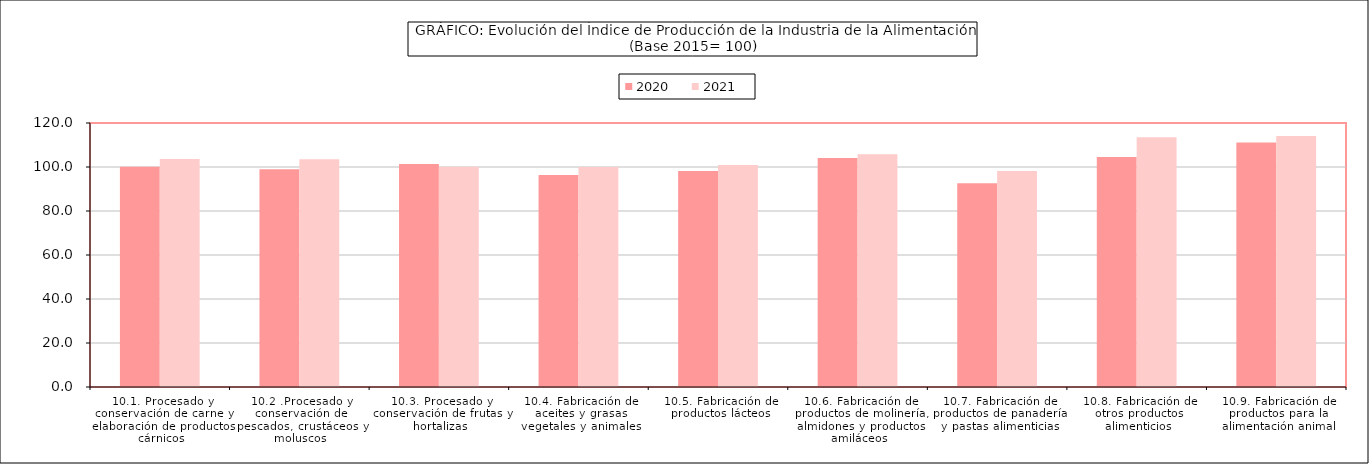
| Category | 2020 | 2021 |
|---|---|---|
| 10.1. Procesado y conservación de carne y elaboración de productos cárnicos | 100.108 | 103.626 |
| 10.2 .Procesado y conservación de pescados, crustáceos y moluscos | 99.009 | 103.574 |
| 10.3. Procesado y conservación de frutas y hortalizas | 101.339 | 100.164 |
| 10.4. Fabricación de aceites y grasas vegetales y animales | 96.402 | 99.958 |
| 10.5. Fabricación de productos lácteos | 98.178 | 100.891 |
| 10.6. Fabricación de productos de molinería, almidones y productos amiláceos | 104.065 | 105.796 |
| 10.7. Fabricación de productos de panadería y pastas alimenticias | 92.607 | 98.134 |
| 10.8. Fabricación de otros productos alimenticios | 104.575 | 113.554 |
| 10.9. Fabricación de productos para la alimentación animal | 111.15 | 114.059 |